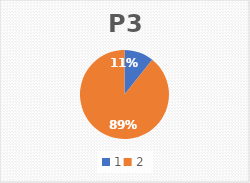
| Category | P3 |
|---|---|
| 0 | 3 |
| 1 | 25 |